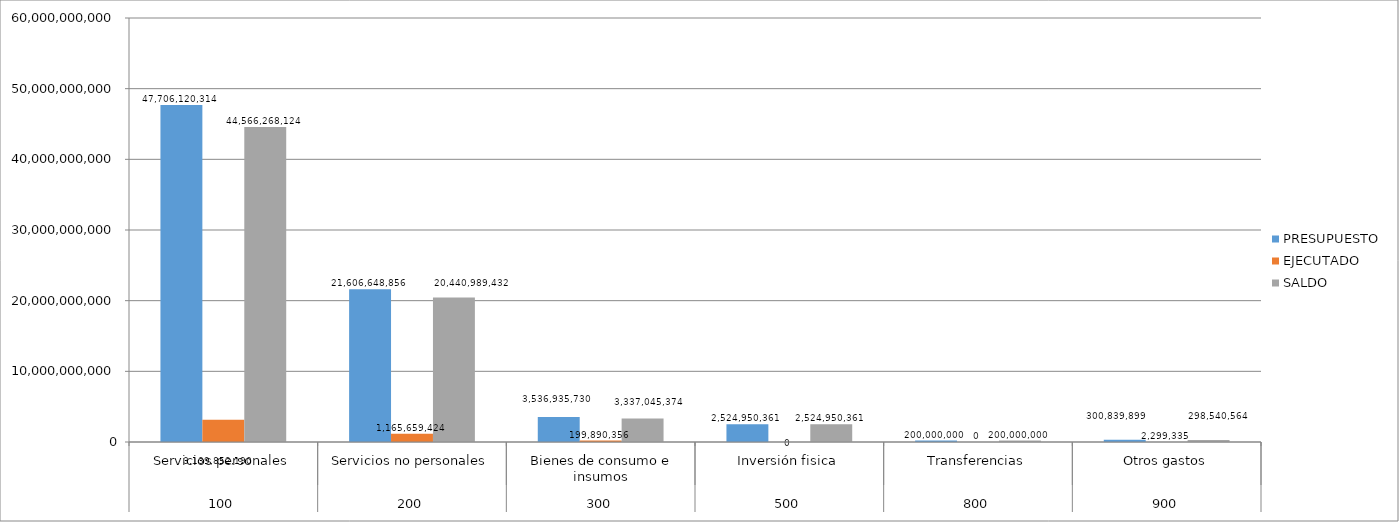
| Category | PRESUPUESTO | EJECUTADO | SALDO |
|---|---|---|---|
| 0 | 47706120314 | 3139852190 | 44566268124 |
| 1 | 21606648856 | 1165659424 | 20440989432 |
| 2 | 3536935730 | 199890356 | 3337045374 |
| 3 | 2524950361 | 0 | 2524950361 |
| 4 | 200000000 | 0 | 200000000 |
| 5 | 300839899 | 2299335 | 298540564 |